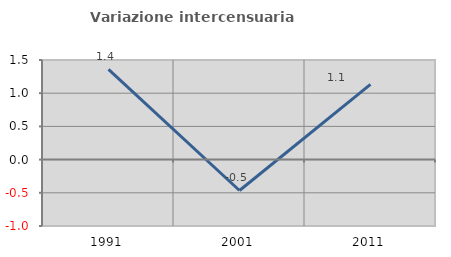
| Category | Variazione intercensuaria annua |
|---|---|
| 1991.0 | 1.359 |
| 2001.0 | -0.465 |
| 2011.0 | 1.133 |